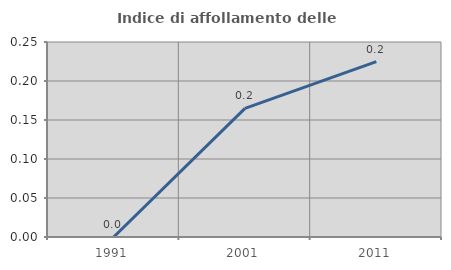
| Category | Indice di affollamento delle abitazioni  |
|---|---|
| 1991.0 | 0 |
| 2001.0 | 0.165 |
| 2011.0 | 0.225 |